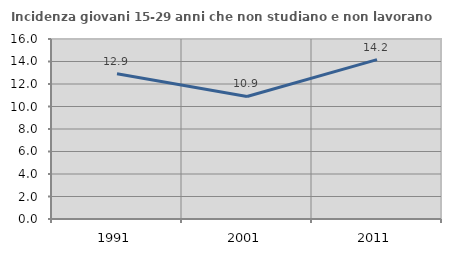
| Category | Incidenza giovani 15-29 anni che non studiano e non lavorano  |
|---|---|
| 1991.0 | 12.903 |
| 2001.0 | 10.895 |
| 2011.0 | 14.168 |